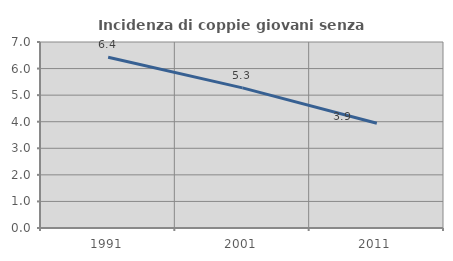
| Category | Incidenza di coppie giovani senza figli |
|---|---|
| 1991.0 | 6.424 |
| 2001.0 | 5.274 |
| 2011.0 | 3.942 |